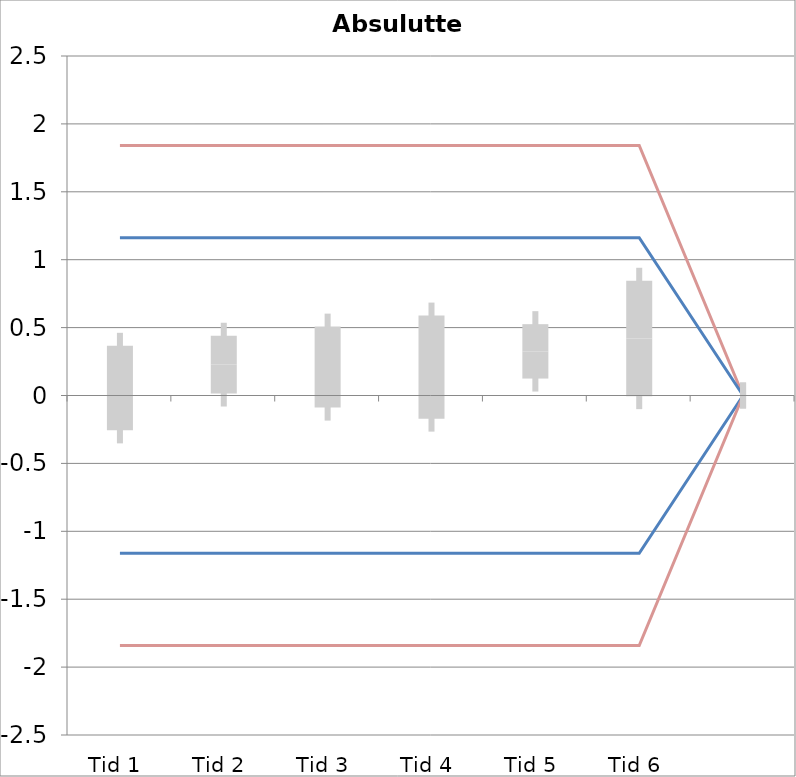
| Category | 1 | 2 | 3 | 4 | 5 | 6 | 7 | 8 | 9 | 10 | 11 | 12 | 13 | 14 | 15 | 16 | 17 | 18 | 19 | 20 | TEa | B | -B | -TEa | M |
|---|---|---|---|---|---|---|---|---|---|---|---|---|---|---|---|---|---|---|---|---|---|---|---|---|---|
| Tid 1 | 0.2 | 0.1 | 0 | -0.4 | -1.1 | -0.1 | 0.4 | 0.3 | 0.5 | 0.3 | 0.4 | 0 | 0 | 0 | 0 | 0 | 0 | 0 | 0 | 0 | 1.841 | 1.161 | -1.161 | -1.841 | 0.055 |
| Tid 2 | -0.1 | 0.1 | 0.2 | -0.5 | 0.3 | 0.4 | 0.5 | 0.3 | 0.7 | 0.3 | 0.3 | 0 | 0 | 0 | 0 | 0 | 0 | 0 | 0 | 0 | 1.841 | 1.161 | -1.161 | -1.841 | 0.227 |
| Tid 3 | 0.4 | 0.3 | 0.2 | 0 | -1 | 0.6 | 0.5 | 0.5 | 0.5 | 0.2 | 0.1 | 0 | 0 | 0 | 0 | 0 | 0 | 0 | 0 | 0 | 1.841 | 1.161 | -1.161 | -1.841 | 0.209 |
| Tid 4 | 0 | 0.4 | -0.1 | -0.4 | -0.8 | 1.3 | 0.5 | 0.5 | 0.7 | 0.1 | 0.1 | 0 | 0 | 0 | 0 | 0 | 0 | 0 | 0 | 0 | 1.841 | 1.161 | -1.161 | -1.841 | 0.209 |
| Tid 5 | 0 | 0 | 0 | 0 | 0 | 0 | 0 | 0.5 | 0.3 | 0.3 | 0.2 | 0 | 0 | 0 | 0 | 0 | 0 | 0 | 0 | 0 | 1.841 | 1.161 | -1.161 | -1.841 | 0.325 |
| Tid 6 | 0 | 0 | 0 | 0 | 0 | 0 | 0.8 | 0.5 | 0.3 | 0.6 | -0.1 | 0 | 0 | 0 | 0 | 0 | 0 | 0 | 0 | 0 | 1.841 | 1.161 | -1.161 | -1.841 | 0.42 |